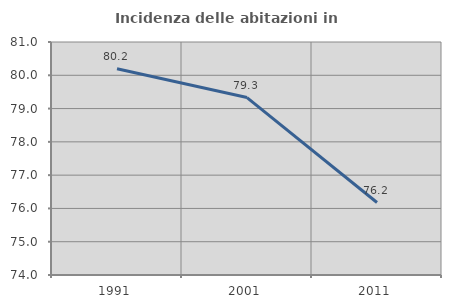
| Category | Incidenza delle abitazioni in proprietà  |
|---|---|
| 1991.0 | 80.195 |
| 2001.0 | 79.331 |
| 2011.0 | 76.177 |